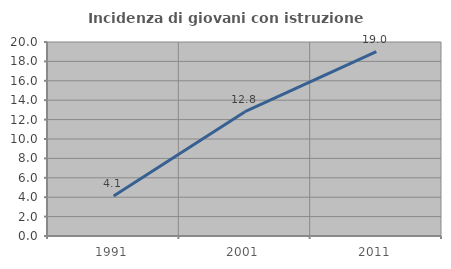
| Category | Incidenza di giovani con istruzione universitaria |
|---|---|
| 1991.0 | 4.132 |
| 2001.0 | 12.821 |
| 2011.0 | 19.008 |